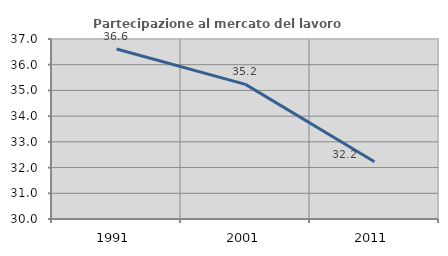
| Category | Partecipazione al mercato del lavoro  femminile |
|---|---|
| 1991.0 | 36.609 |
| 2001.0 | 35.234 |
| 2011.0 | 32.225 |